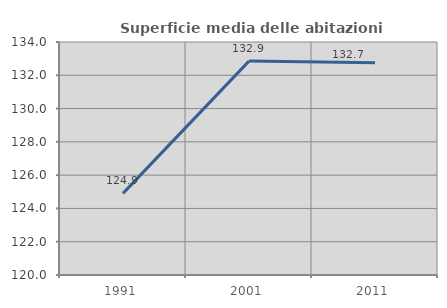
| Category | Superficie media delle abitazioni occupate |
|---|---|
| 1991.0 | 124.903 |
| 2001.0 | 132.852 |
| 2011.0 | 132.746 |